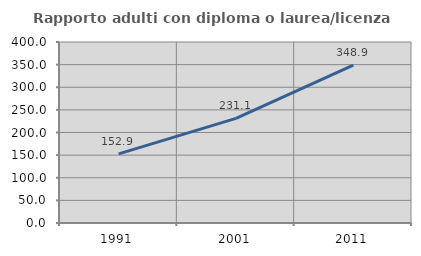
| Category | Rapporto adulti con diploma o laurea/licenza media  |
|---|---|
| 1991.0 | 152.881 |
| 2001.0 | 231.09 |
| 2011.0 | 348.928 |